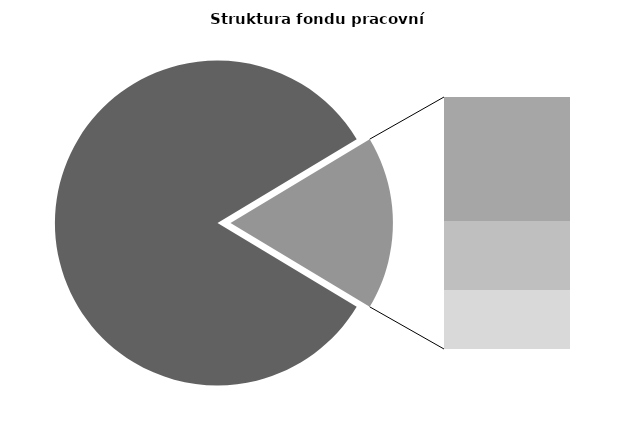
| Category | Series 0 |
|---|---|
| Průměrná měsíční odpracovaná doba bez přesčasu | 139.249 |
| Dovolená | 14.296 |
| Nemoc | 7.944 |
| Jiné | 6.8 |